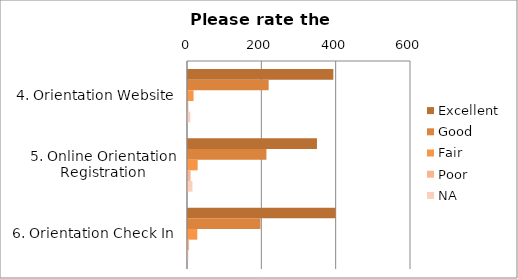
| Category | Excellent | Good | Fair | Poor | NA |
|---|---|---|---|---|---|
| 4. Orientation Website | 391 | 217 | 15 | 1 | 6 |
| 5. Online Orientation Registration | 347 | 211 | 26 | 7 | 12 |
| 6. Orientation Check In | 397 | 195 | 25 | 3 | 1 |